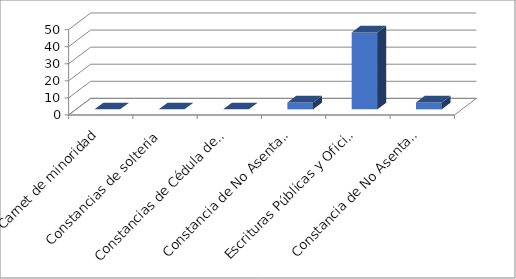
| Category | Series 0 |
|---|---|
| Carnet de minoridad | 0 |
| Constancias de solteria | 0 |
| Constancias de Cédula de Identidad Personal | 0 |
| Constancia de No Asentamiento de  Partidas de Nacimientos | 4 |
| Escrituras Públicas y Oficios Recibidos | 45 |
| Constancia de No Asentamiento de  Partidas de Nacimientos | 4 |